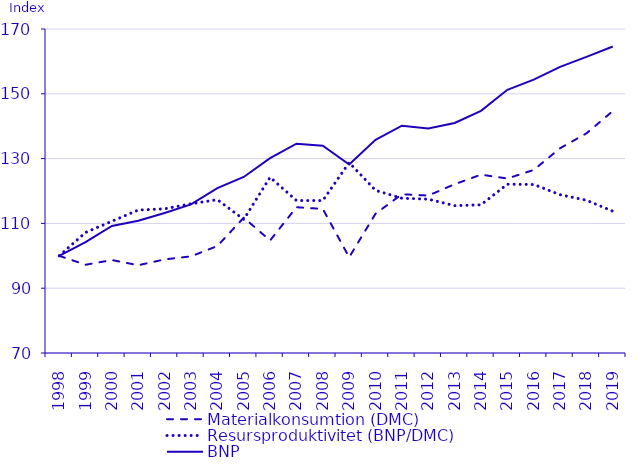
| Category | Materialkonsumtion (DMC) | Resursproduktivitet (BNP/DMC) | BNP |
|---|---|---|---|
| 1998.0 | 100 | 100 | 100 |
| 1999.0 | 97.241 | 107.205 | 104.247 |
| 2000.0 | 98.687 | 110.669 | 109.216 |
| 2001.0 | 97.091 | 114.118 | 110.799 |
| 2002.0 | 98.892 | 114.502 | 113.233 |
| 2003.0 | 99.823 | 116.054 | 115.849 |
| 2004.0 | 103.025 | 117.324 | 120.873 |
| 2005.0 | 111.765 | 111.24 | 124.328 |
| 2006.0 | 104.734 | 124.243 | 130.126 |
| 2007.0 | 114.994 | 117.051 | 134.601 |
| 2008.0 | 114.471 | 117.055 | 133.994 |
| 2009.0 | 99.544 | 128.766 | 128.179 |
| 2010.0 | 112.991 | 120.194 | 135.809 |
| 2011.0 | 119.002 | 117.77 | 140.148 |
| 2012.0 | 118.591 | 117.482 | 139.324 |
| 2013.0 | 122.089 | 115.472 | 140.979 |
| 2014.0 | 125.049 | 115.735 | 144.726 |
| 2015.0 | 123.857 | 122.095 | 151.223 |
| 2016.0 | 126.506 | 122.013 | 154.354 |
| 2017.0 | 133.201 | 118.856 | 158.318 |
| 2018.0 | 137.784 | 117.143 | 161.405 |
| 2019.0 | 144.686 | 113.771 | 164.611 |